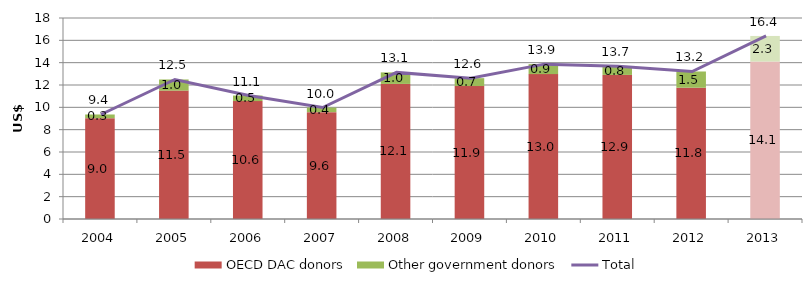
| Category | OECD DAC donors | Other government donors |
|---|---|---|
| 2004.0 | 9.03 | 0.329 |
| 2005.0 | 11.499 | 0.996 |
| 2006.0 | 10.559 | 0.497 |
| 2007.0 | 9.57 | 0.41 |
| 2008.0 | 12.096 | 1.033 |
| 2009.0 | 11.907 | 0.706 |
| 2010.0 | 12.976 | 0.892 |
| 2011.0 | 12.902 | 0.784 |
| 2012.0 | 11.755 | 1.455 |
| 2013.0 | 14.1 | 2.293 |